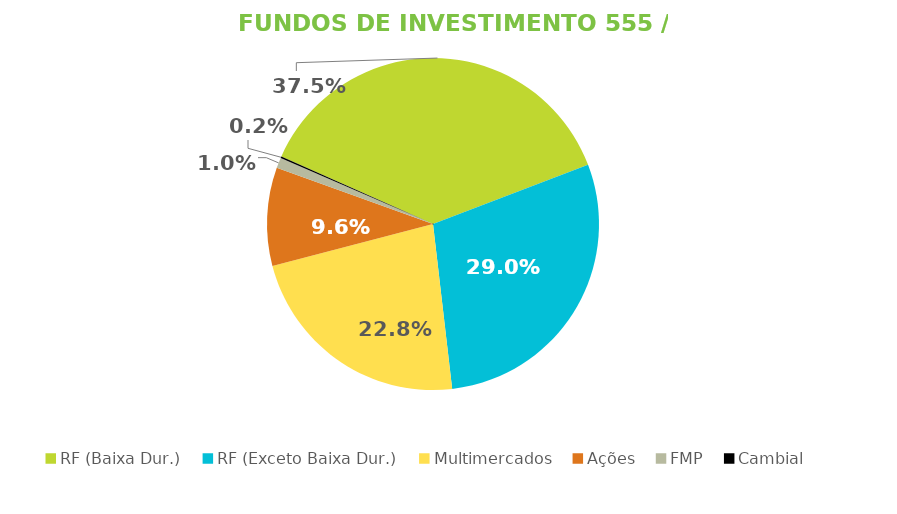
| Category | Fundos de Investimento 555 / FMP |
|---|---|
| RF (Baixa Dur.) | 0.375 |
| RF (Exceto Baixa Dur.) | 0.29 |
| Multimercados | 0.228 |
| Ações | 0.096 |
| FMP | 0.01 |
| Cambial | 0.002 |